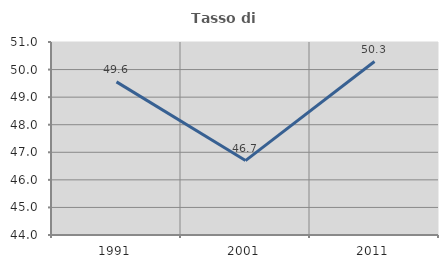
| Category | Tasso di occupazione   |
|---|---|
| 1991.0 | 49.553 |
| 2001.0 | 46.699 |
| 2011.0 | 50.292 |